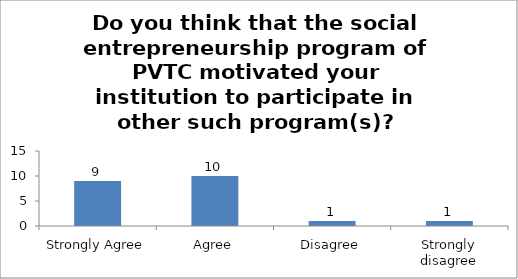
| Category | Do you think that the social entrepreneurship program of PVTC motivated your institution to participate in other such program(s)? |
|---|---|
| Strongly Agree | 9 |
| Agree | 10 |
| Disagree | 1 |
| Strongly disagree | 1 |